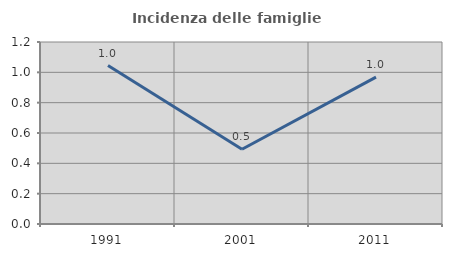
| Category | Incidenza delle famiglie numerose |
|---|---|
| 1991.0 | 1.044 |
| 2001.0 | 0.493 |
| 2011.0 | 0.969 |